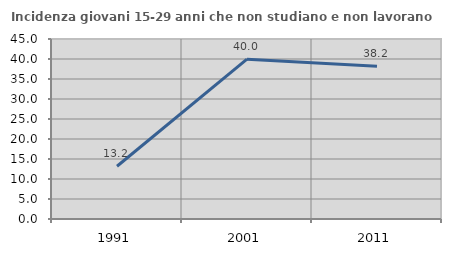
| Category | Incidenza giovani 15-29 anni che non studiano e non lavorano  |
|---|---|
| 1991.0 | 13.182 |
| 2001.0 | 39.957 |
| 2011.0 | 38.16 |